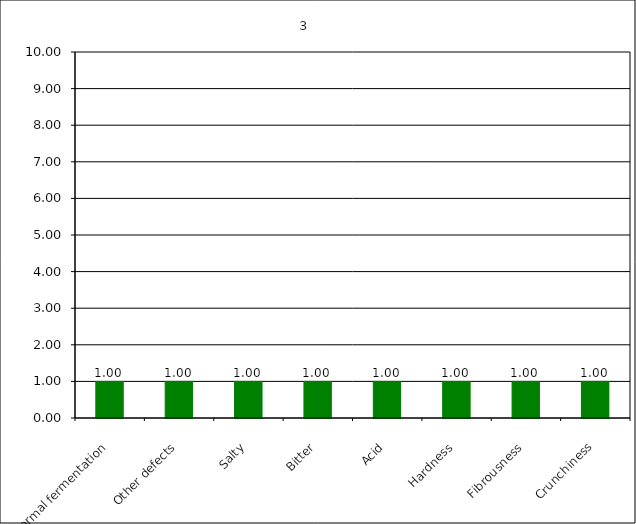
| Category | 3 |
|---|---|
| Abnormal fermentation | 1 |
| Other defects | 1 |
| Salty | 1 |
| Bitter | 1 |
| Acid | 1 |
| Hardness | 1 |
| Fibrousness | 1 |
| Crunchiness | 1 |